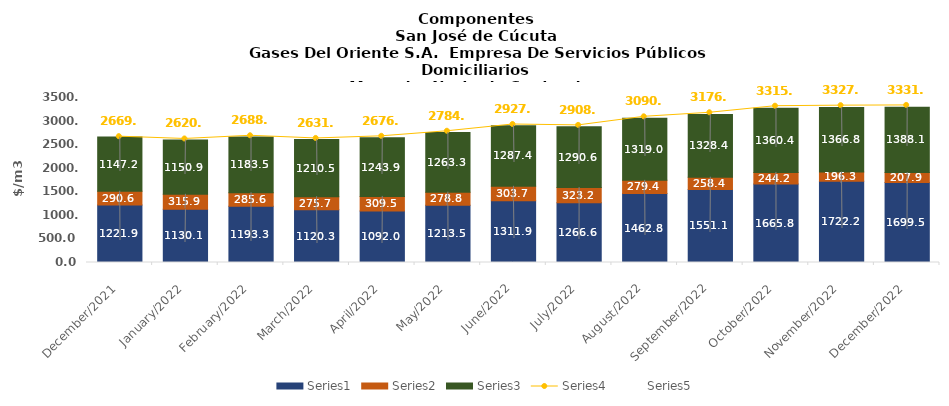
| Category | Series 0 | Series 1 | Series 2 |
|---|---|---|---|
| 2021-12-01 | 1221.86 | 290.55 | 1147.22 |
| 2022-01-01 | 1130.08 | 315.87 | 1150.94 |
| 2022-02-01 | 1193.32 | 285.55 | 1183.5 |
| 2022-03-01 | 1120.29 | 275.73 | 1210.53 |
| 2022-04-01 | 1092 | 309.51 | 1243.93 |
| 2022-05-01 | 1213.53 | 278.75 | 1263.34 |
| 2022-06-01 | 1311.85 | 303.7 | 1287.39 |
| 2022-07-01 | 1266.62 | 323.18 | 1290.61 |
| 2022-08-01 | 1462.83 | 279.37 | 1319 |
| 2022-09-01 | 1551.06 | 258.41 | 1328.42 |
| 2022-10-01 | 1665.75 | 244.23 | 1360.41 |
| 2022-11-01 | 1722.18 | 196.33 | 1366.84 |
| 2022-12-01 | 1699.54 | 207.91 | 1388.06 |